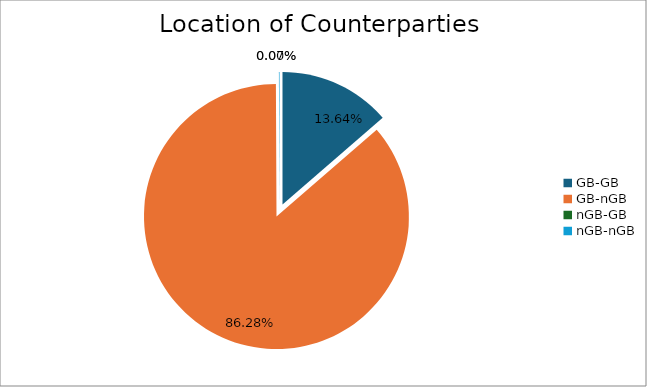
| Category | Series 0 |
|---|---|
| GB-GB | 1392707.781 |
| GB-nGB | 8806764.546 |
| nGB-GB | 0 |
| nGB-nGB | 7372.552 |